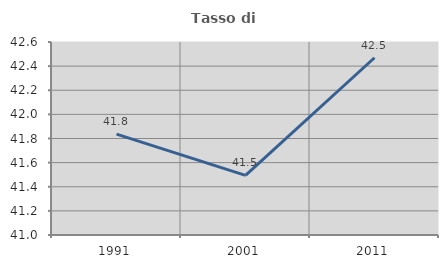
| Category | Tasso di occupazione   |
|---|---|
| 1991.0 | 41.836 |
| 2001.0 | 41.494 |
| 2011.0 | 42.469 |